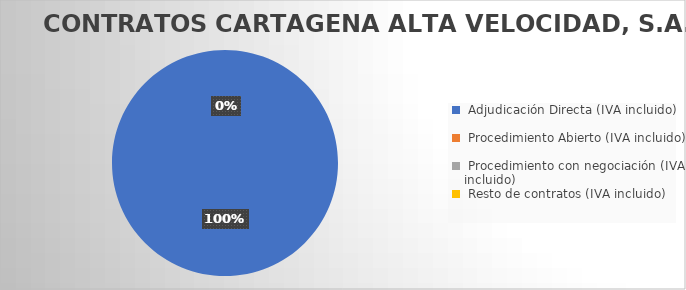
| Category | Series 0 |
|---|---|
|  Adjudicación Directa (IVA incluido)  | 653.4 |
|  Procedimiento Abierto (IVA incluido)  | 0 |
|  Procedimiento con negociación (IVA incluido)  | 0 |
|  Resto de contratos (IVA incluido)  | 0 |